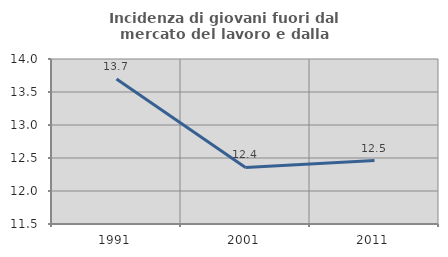
| Category | Incidenza di giovani fuori dal mercato del lavoro e dalla formazione  |
|---|---|
| 1991.0 | 13.695 |
| 2001.0 | 12.356 |
| 2011.0 | 12.461 |